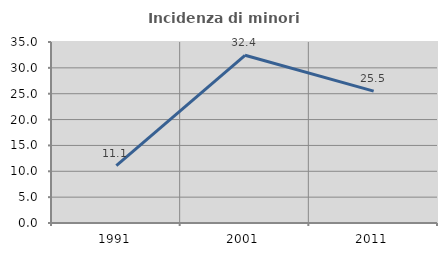
| Category | Incidenza di minori stranieri |
|---|---|
| 1991.0 | 11.111 |
| 2001.0 | 32.432 |
| 2011.0 | 25.498 |